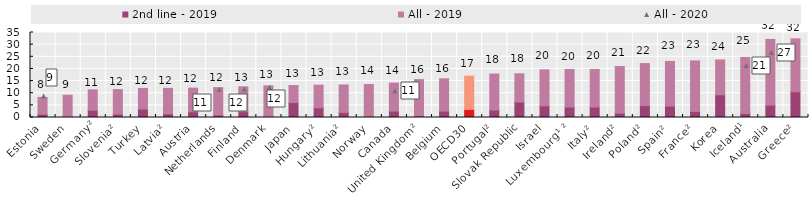
| Category | 2nd line - 2019 | All - 2019 |
|---|---|---|
| Estonia | 1.333 | 6.937 |
| Sweden | 0.402 | 8.768 |
| Germany² | 3 | 8.4 |
| Slovenia² | 1.4 | 10.1 |
| Turkey | 3.501 | 8.471 |
| Latvia² | 1.5 | 10.5 |
| Austria | 2.38 | 9.714 |
| Netherlands | 1.004 | 11.287 |
| Finland | 2.407 | 10.213 |
| Denmark | 0.385 | 12.634 |
| Japan | 6.16 | 6.98 |
| Hungary² | 4 | 9.3 |
| Lithuania² | 2.1 | 11.3 |
| Norway | 0.4 | 13.2 |
| Canada | 2.667 | 11.487 |
| United Kingdom² | 0.6 | 15 |
| Belgium | 2.645 | 13.292 |
| OECD30 | 3.311 | 13.728 |
| Portugal² | 3.1 | 14.8 |
| Slovak Republic | 6.4 | 11.6 |
| Israel | 4.788 | 14.822 |
| Luxembourg¹ ² | 4.3 | 15.5 |
| Italy² | 4.3 | 15.5 |
| Ireland² | 1.8 | 19.2 |
| Poland² | 4.9 | 17.3 |
| Spain² | 4.7 | 18.4 |
| France² | 2.5 | 20.8 |
| Korea | 9.351 | 14.334 |
| Iceland¹ | 1.667 | 23.083 |
| Australia | 5.04 | 27.115 |
| Greece² | 10.6 | 21.8 |